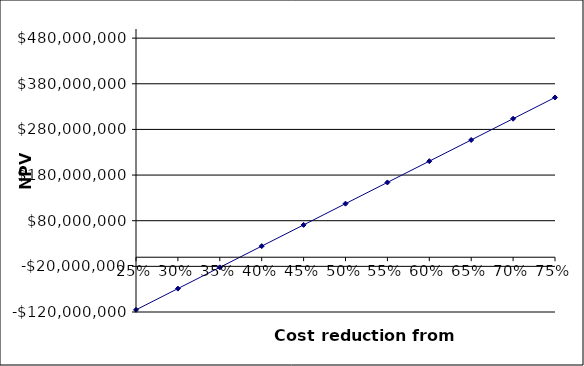
| Category | NPV |
|---|---|
| 0.25 | -115266093.01 |
| 0.3 | -68742800.84 |
| 0.35 | -22219508.67 |
| 0.4 | 24303783.5 |
| 0.45 | 70827075.67 |
| 0.5 | 117350367.84 |
| 0.55 | 163873660.01 |
| 0.6 | 210396952.18 |
| 0.65 | 256920244.35 |
| 0.7 | 303443536.52 |
| 0.75 | 349966828.69 |